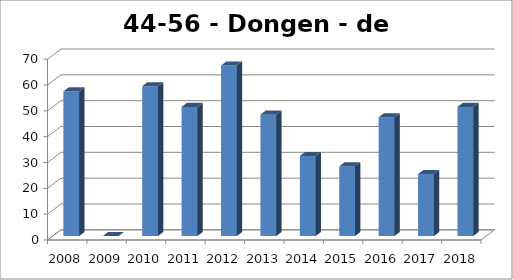
| Category | Dongen - de Moer |
|---|---|
| 2008.0 | 56 |
| 2009.0 | 0 |
| 2010.0 | 58 |
| 2011.0 | 50 |
| 2012.0 | 66 |
| 2013.0 | 47 |
| 2014.0 | 31 |
| 2015.0 | 27 |
| 2016.0 | 46 |
| 2017.0 | 24 |
| 2018.0 | 50 |